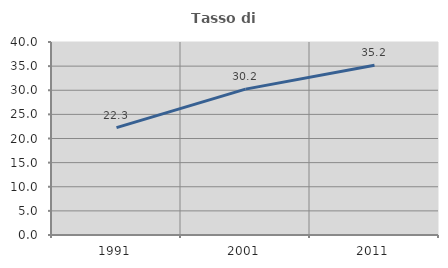
| Category | Tasso di occupazione   |
|---|---|
| 1991.0 | 22.255 |
| 2001.0 | 30.233 |
| 2011.0 | 35.175 |